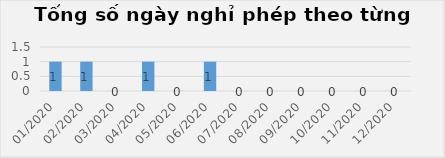
| Category | 0001 |
|---|---|
| 01/2020 | 1 |
| 02/2020 | 1 |
| 03/2020 | 0 |
| 04/2020 | 1 |
| 05/2020 | 0 |
| 06/2020 | 1 |
| 07/2020 | 0 |
| 08/2020 | 0 |
| 09/2020 | 0 |
| 10/2020 | 0 |
| 11/2020 | 0 |
| 12/2020 | 0 |